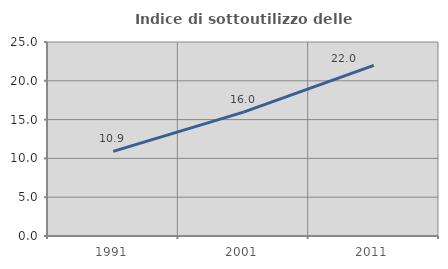
| Category | Indice di sottoutilizzo delle abitazioni  |
|---|---|
| 1991.0 | 10.909 |
| 2001.0 | 15.964 |
| 2011.0 | 21.978 |